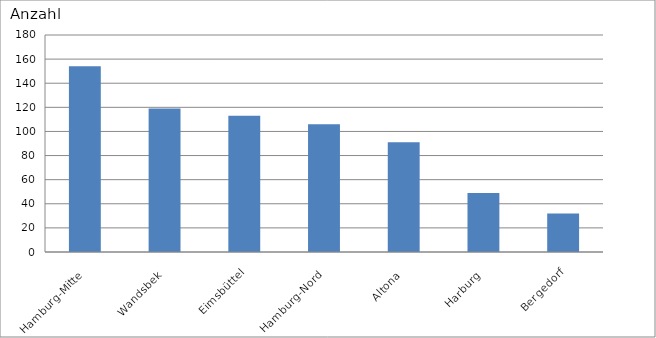
| Category | Hamburg-Mitte |
|---|---|
| Hamburg-Mitte | 154 |
| Wandsbek | 119 |
| Eimsbüttel | 113 |
| Hamburg-Nord | 106 |
| Altona | 91 |
| Harburg | 49 |
| Bergedorf | 32 |